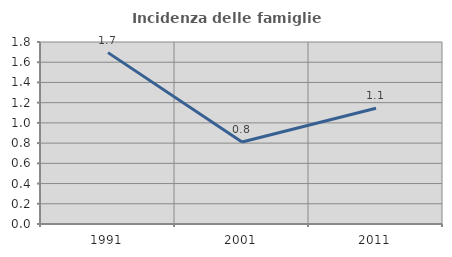
| Category | Incidenza delle famiglie numerose |
|---|---|
| 1991.0 | 1.695 |
| 2001.0 | 0.811 |
| 2011.0 | 1.145 |